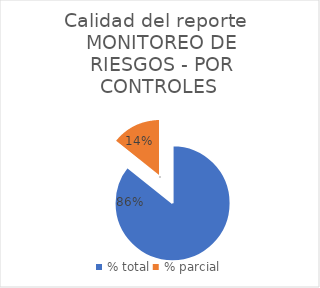
| Category | Series 0 |
|---|---|
| % total | 0.857 |
| % parcial | 0.143 |